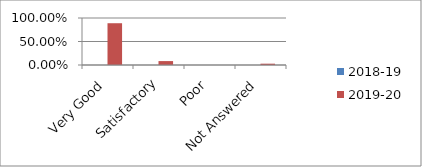
| Category | 2018-19 | 2019-20 |
|---|---|---|
| Very Good | 0 | 0.889 |
| Satisfactory | 0 | 0.083 |
| Poor | 0 | 0 |
| Not Answered | 0 | 0.028 |